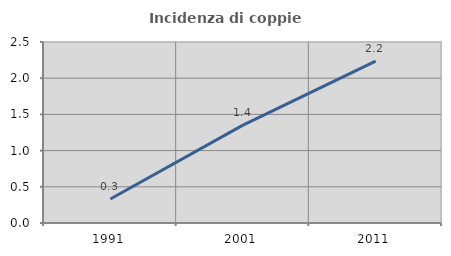
| Category | Incidenza di coppie miste |
|---|---|
| 1991.0 | 0.331 |
| 2001.0 | 1.351 |
| 2011.0 | 2.237 |